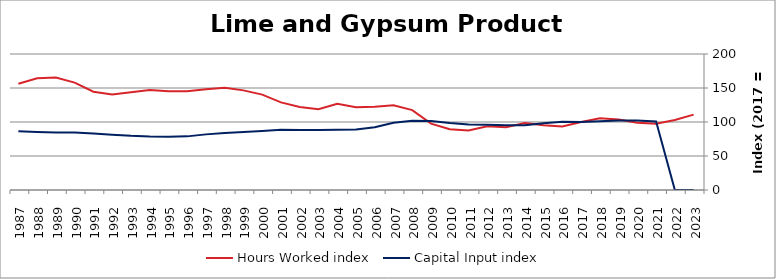
| Category | Hours Worked index | Capital Input index |
|---|---|---|
| 2023.0 | 110.829 | 0 |
| 2022.0 | 102.922 | 0 |
| 2021.0 | 97.474 | 100.794 |
| 2020.0 | 98.782 | 102.322 |
| 2019.0 | 103.752 | 102.123 |
| 2018.0 | 105.338 | 100.99 |
| 2017.0 | 100 | 100 |
| 2016.0 | 93.351 | 100.212 |
| 2015.0 | 95.284 | 98.269 |
| 2014.0 | 98.604 | 95.096 |
| 2013.0 | 92.187 | 95.292 |
| 2012.0 | 93.77 | 96.06 |
| 2011.0 | 87.648 | 96.468 |
| 2010.0 | 89.259 | 98.635 |
| 2009.0 | 97.608 | 101.449 |
| 2008.0 | 117.527 | 101.947 |
| 2007.0 | 124.5 | 98.768 |
| 2006.0 | 122.476 | 92.377 |
| 2005.0 | 121.662 | 89.124 |
| 2004.0 | 126.72 | 88.783 |
| 2003.0 | 118.699 | 88.372 |
| 2002.0 | 122.209 | 88.073 |
| 2001.0 | 128.894 | 88.461 |
| 2000.0 | 140.242 | 86.851 |
| 1999.0 | 146.512 | 85.356 |
| 1998.0 | 150.417 | 83.729 |
| 1997.0 | 148.283 | 81.799 |
| 1996.0 | 145.153 | 78.866 |
| 1995.0 | 145.175 | 78.351 |
| 1994.0 | 147.191 | 78.622 |
| 1993.0 | 143.744 | 79.69 |
| 1992.0 | 140.583 | 81.416 |
| 1991.0 | 144.595 | 83.191 |
| 1990.0 | 157.949 | 84.56 |
| 1989.0 | 165.364 | 84.385 |
| 1988.0 | 164.398 | 85.402 |
| 1987.0 | 156.224 | 86.321 |